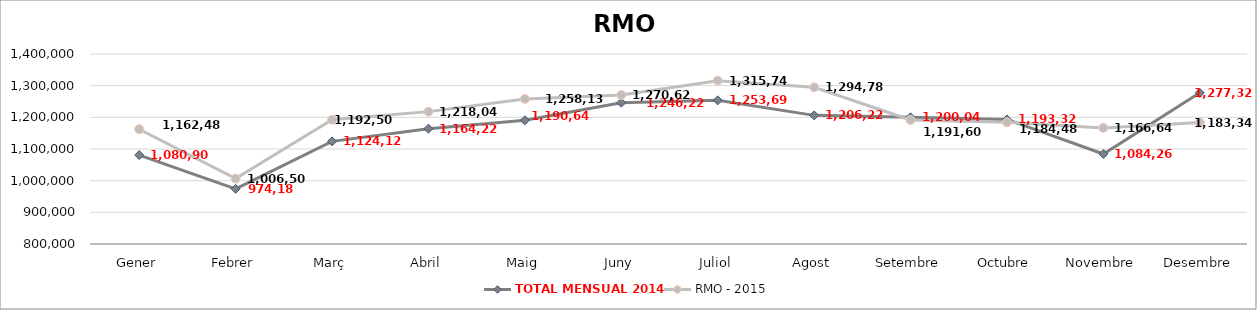
| Category | TOTAL MENSUAL 2014 | RMO - 2015 |
|---|---|---|
| Gener | 1080900 | 1162479.99 |
| Febrer | 974180 | 1006499.55 |
| Març | 1124120 | 1192499.99 |
| Abril | 1164220 | 1218040 |
| Maig | 1190640 | 1258138.99 |
| Juny | 1246220 | 1270620 |
| Juliol | 1253689.99 | 1315740 |
| Agost | 1206220 | 1294779.99 |
| Setembre | 1200040 | 1191600 |
| Octubre | 1193320 | 1184480 |
| Novembre | 1084260 | 1166640 |
| Desembre | 1277320 | 1183339.99 |